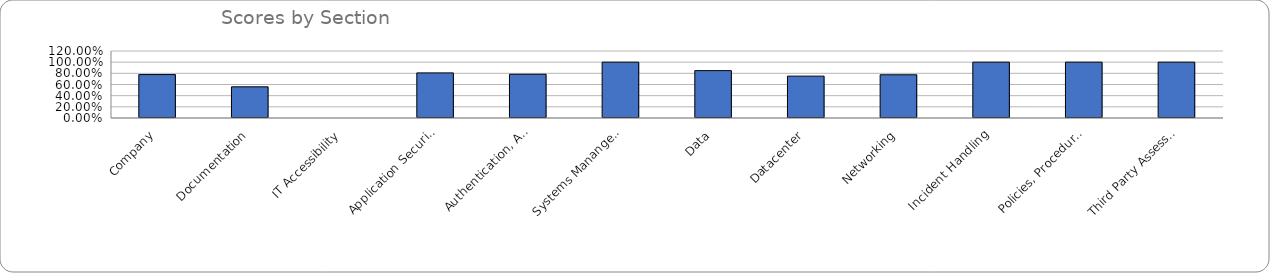
| Category | Series 0 |
|---|---|
| Company | 0.778 |
| Documentation | 0.558 |
| IT Accessibility | 0 |
| Application Security | 0.808 |
| Authentication, Authorization, and Accounting | 0.784 |
| Systems Manangement | 1 |
| Data | 0.848 |
| Datacenter | 0.75 |
| Networking | 0.774 |
| Incident Handling | 1 |
| Policies, Procedures, and Practices | 1 |
| Third Party Assessment | 1 |